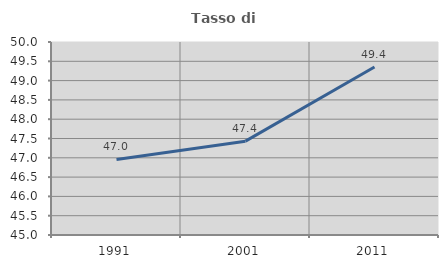
| Category | Tasso di occupazione   |
|---|---|
| 1991.0 | 46.958 |
| 2001.0 | 47.431 |
| 2011.0 | 49.351 |